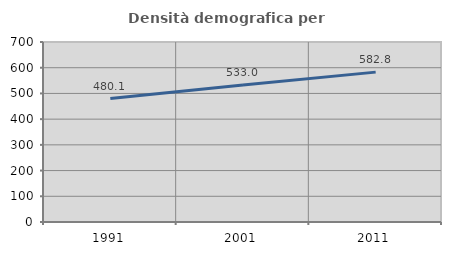
| Category | Densità demografica |
|---|---|
| 1991.0 | 480.1 |
| 2001.0 | 532.954 |
| 2011.0 | 582.843 |